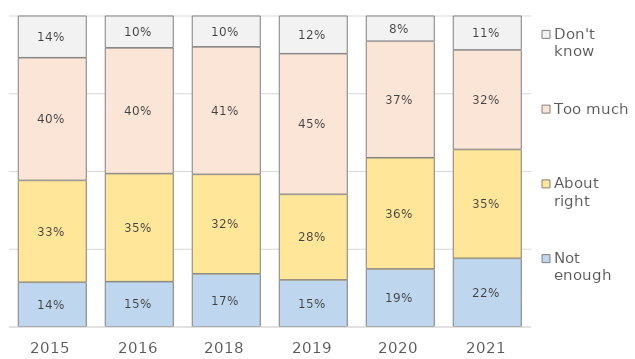
| Category | Not enough | About right | Too much | Don't know |
|---|---|---|---|---|
| 2015.0 | 0.143 | 0.328 | 0.395 | 0.135 |
| 2016.0 | 0.145 | 0.347 | 0.404 | 0.103 |
| 2018.0 | 0.17 | 0.32 | 0.41 | 0.1 |
| 2019.0 | 0.15 | 0.275 | 0.452 | 0.122 |
| 2020.0 | 0.186 | 0.358 | 0.375 | 0.082 |
| 2021.0 | 0.22 | 0.35 | 0.32 | 0.11 |